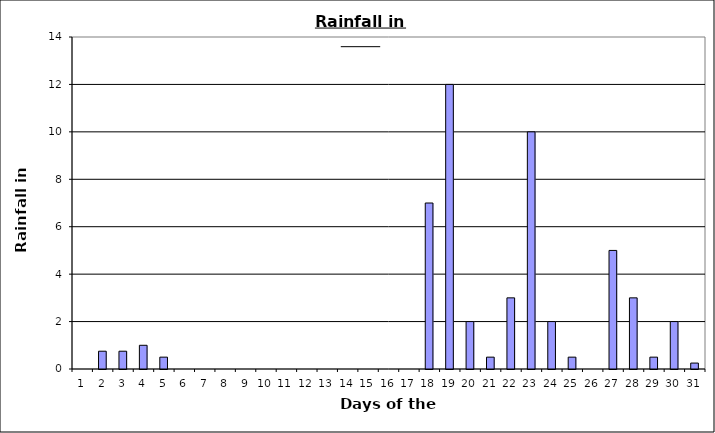
| Category | Series 0 |
|---|---|
| 0 | 0 |
| 1 | 0.75 |
| 2 | 0.75 |
| 3 | 1 |
| 4 | 0.5 |
| 5 | 0 |
| 6 | 0 |
| 7 | 0 |
| 8 | 0 |
| 9 | 0 |
| 10 | 0 |
| 11 | 0 |
| 12 | 0 |
| 13 | 0 |
| 14 | 0 |
| 15 | 0 |
| 16 | 0 |
| 17 | 7 |
| 18 | 12 |
| 19 | 2 |
| 20 | 0.5 |
| 21 | 3 |
| 22 | 10 |
| 23 | 2 |
| 24 | 0.5 |
| 25 | 0 |
| 26 | 5 |
| 27 | 3 |
| 28 | 0.5 |
| 29 | 2 |
| 30 | 0.25 |